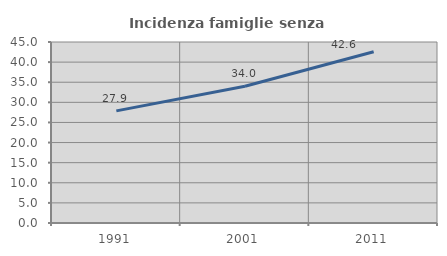
| Category | Incidenza famiglie senza nuclei |
|---|---|
| 1991.0 | 27.881 |
| 2001.0 | 34.011 |
| 2011.0 | 42.59 |